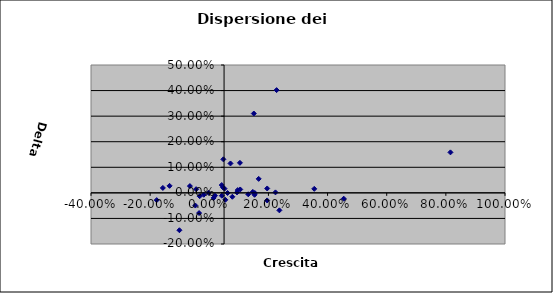
| Category | Series 0 |
|---|---|
| -0.04453911696359414 | 0.014 |
| 0.09368589629764923 | 0.002 |
| 0.04204958278961368 | 0.031 |
| 0.8155060087730683 | 0.158 |
| 0.07167576807112264 | 0.115 |
| -0.06551059049298602 | 0.026 |
| 0.04755517945264898 | 0.131 |
| 0.05148621405350706 | 0.017 |
| 0.1046494680075789 | 0.013 |
| -0.03242590465911366 | -0.013 |
| 0.0424087975402343 | -0.011 |
| 0.1670329670329671 | 0.055 |
| -0.17776837950236135 | -0.028 |
| 0.15398254462825567 | -0.001 |
| 0.0961368336876478 | 0.011 |
| 0.22376960816667757 | 0.002 |
| 0.046242774566473965 | 0.021 |
| 0.14721809665257624 | 0.004 |
| 0.10356915232632247 | 0.117 |
| 0.19588356956502473 | 0.017 |
| -0.002203026262392105 | 0 |
| 0.15052102576522786 | 0.31 |
| 0.45459459578965045 | -0.023 |
| 0.354971850535275 | 0.016 |
| 0.22766607372747338 | 0.402 |
| 0.06179935538662651 | -0.001 |
| 0.13179225457820465 | -0.006 |
| -0.10103713616594179 | -0.146 |
| 0.019250780437044757 | -0.011 |
| 0.1530574690617339 | -0.008 |
| -0.04713992919694432 | -0.05 |
| -0.03455829686674938 | -0.079 |
| 0.05429292929292928 | -0.027 |
| 0.0779292083802956 | -0.015 |
| -0.018685713014904404 | -0.007 |
| 0.014742999796861334 | -0.02 |
| -0.1342614460327326 | 0.027 |
| -0.1570330269365965 | 0.019 |
| 0.23705528389524133 | -0.068 |
| 0.19565189987772547 | -0.03 |